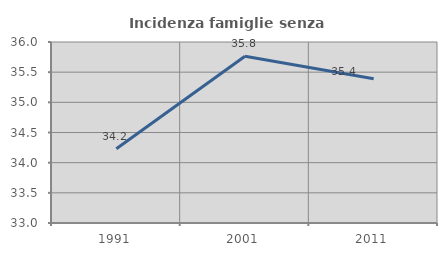
| Category | Incidenza famiglie senza nuclei |
|---|---|
| 1991.0 | 34.231 |
| 2001.0 | 35.764 |
| 2011.0 | 35.39 |